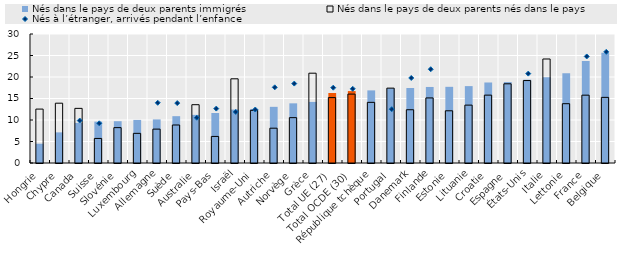
| Category | Nés dans le pays de deux parents immigrés | Nés dans le pays de deux parents nés dans le pays |
|---|---|---|
| Hongrie | 4.485 | 12.537 |
| Chypre | 7.124 | 13.907 |
| Canada | 9.331 | 12.706 |
| Suisse | 9.62 | 5.71 |
| Slovénie | 9.719 | 8.224 |
| Luxembourg | 10.018 | 6.895 |
| Allemagne | 10.138 | 7.879 |
| Suède | 10.892 | 8.838 |
| Australie | 11.195 | 13.557 |
| Pays-Bas | 11.628 | 6.179 |
| Israël | 12.43 | 19.58 |
| Royaume-Uni | 12.57 | 12.25 |
| Autriche | 13.062 | 8.093 |
| Norvège | 13.876 | 10.547 |
| Grèce | 14.207 | 20.886 |
| Total UE (27) | 16.281 | 15.207 |
| Total OCDE (30) | 16.729 | 16.023 |
| République tchèque | 16.889 | 14.106 |
| Portugal | 17.37 | 17.41 |
| Danemark | 17.436 | 12.384 |
| Finlande | 17.683 | 15.133 |
| Estonie | 17.715 | 12.141 |
| Lituanie | 17.881 | 13.461 |
| Croatie | 18.723 | 15.784 |
| Espagne | 18.831 | 18.417 |
| États-Unis | 19.376 | 19.174 |
| Italie | 19.931 | 24.189 |
| Lettonie | 20.882 | 13.792 |
| France | 23.723 | 15.775 |
| Belgique | 25.661 | 15.263 |